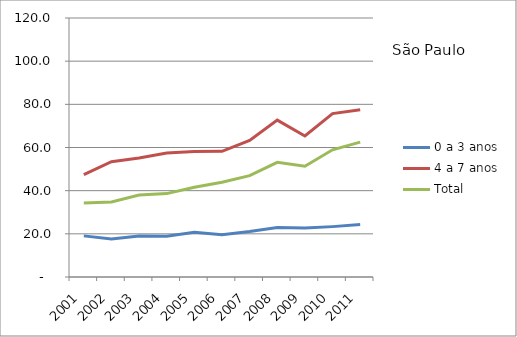
| Category | 0 a 3 anos | 4 a 7 anos | Total |
|---|---|---|---|
| 2001.0 | 19.05 | 47.39 | 34.32 |
| 2002.0 | 17.63 | 53.44 | 34.76 |
| 2003.0 | 19.01 | 55.12 | 37.98 |
| 2004.0 | 18.9 | 57.42 | 38.64 |
| 2005.0 | 20.71 | 58.18 | 41.55 |
| 2006.0 | 19.55 | 58.23 | 43.88 |
| 2007.0 | 21.04 | 63.31 | 46.97 |
| 2008.0 | 22.93 | 72.68 | 53.12 |
| 2009.0 | 22.66 | 65.32 | 51.29 |
| 2010.0 | 23.34 | 75.7 | 58.94 |
| 2011.0 | 24.3 | 77.48 | 62.48 |